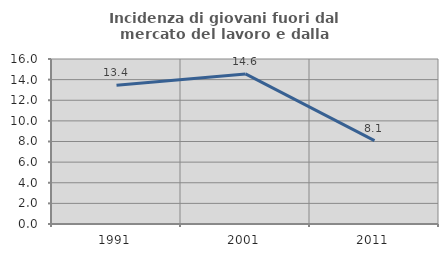
| Category | Incidenza di giovani fuori dal mercato del lavoro e dalla formazione  |
|---|---|
| 1991.0 | 13.445 |
| 2001.0 | 14.55 |
| 2011.0 | 8.088 |